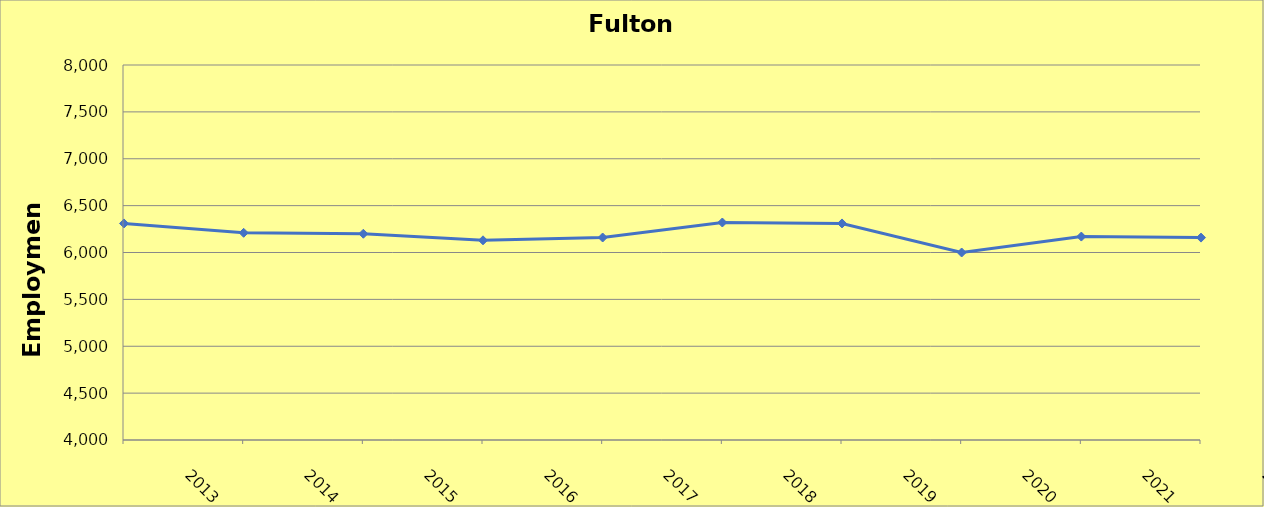
| Category | Fulton County |
|---|---|
| 2013.0 | 6310 |
| 2014.0 | 6210 |
| 2015.0 | 6200 |
| 2016.0 | 6130 |
| 2017.0 | 6160 |
| 2018.0 | 6320 |
| 2019.0 | 6310 |
| 2020.0 | 6000 |
| 2021.0 | 6170 |
| 2022.0 | 6159 |